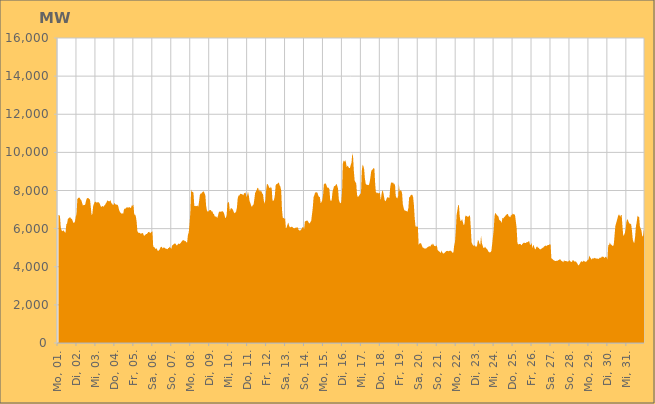
| Category | Series 0 |
|---|---|
|  Mo, 01.  | 6721.456 |
|  Mo, 01.  | 6715.736 |
|  Mo, 01.  | 6638.319 |
|  Mo, 01.  | 6068.683 |
|  Mo, 01.  | 5915.708 |
|  Mo, 01.  | 5864.651 |
|  Mo, 01.  | 5909.291 |
|  Mo, 01.  | 5881.217 |
|  Mo, 01.  | 5816.516 |
|  Mo, 01.  | 5782.45 |
|  Mo, 01.  | 6218.133 |
|  Mo, 01.  | 6266.348 |
|  Mo, 01.  | 6505.071 |
|  Mo, 01.  | 6544.026 |
|  Mo, 01.  | 6581.026 |
|  Mo, 01.  | 6597.355 |
|  Mo, 01.  | 6509.594 |
|  Di, 02.  | 6519.329 |
|  Di, 02.  | 6408.135 |
|  Di, 02.  | 6302.622 |
|  Di, 02.  | 6310.357 |
|  Di, 02.  | 6385.379 |
|  Di, 02.  | 6624.609 |
|  Di, 02.  | 6781.315 |
|  Di, 02.  | 7554.946 |
|  Di, 02.  | 7601.423 |
|  Di, 02.  | 7639.226 |
|  Di, 02.  | 7614.635 |
|  Di, 02.  | 7529.796 |
|  Di, 02.  | 7491.225 |
|  Di, 02.  | 7352.841 |
|  Di, 02.  | 7217.623 |
|  Di, 02.  | 7236.093 |
|  Di, 02.  | 7233.353 |
|  Di, 02.  | 7275.262 |
|  Di, 02.  | 7465.983 |
|  Di, 02.  | 7584.366 |
|  Di, 02.  | 7604.754 |
|  Di, 02.  | 7603.25 |
|  Di, 02.  | 7538.598 |
|  Di, 02.  | 7534.036 |
|  Mi, 03.  | 7130.416 |
|  Mi, 03.  | 6714.614 |
|  Mi, 03.  | 6768.745 |
|  Mi, 03.  | 7181.91 |
|  Mi, 03.  | 7298.979 |
|  Mi, 03.  | 7393.511 |
|  Mi, 03.  | 7416.036 |
|  Mi, 03.  | 7377.556 |
|  Mi, 03.  | 7366.099 |
|  Mi, 03.  | 7392.624 |
|  Mi, 03.  | 7378.483 |
|  Mi, 03.  | 7337.682 |
|  Mi, 03.  | 7235.39 |
|  Mi, 03.  | 7137.836 |
|  Mi, 03.  | 7163.586 |
|  Mi, 03.  | 7190.114 |
|  Mi, 03.  | 7146.197 |
|  Mi, 03.  | 7204.214 |
|  Mi, 03.  | 7240.93 |
|  Mi, 03.  | 7320.254 |
|  Mi, 03.  | 7383.533 |
|  Mi, 03.  | 7482.576 |
|  Mi, 03.  | 7445.427 |
|  Mi, 03.  | 7438.531 |
|  Do, 04.  | 7436.663 |
|  Do, 04.  | 7498.555 |
|  Do, 04.  | 7336.751 |
|  Do, 04.  | 7312.476 |
|  Do, 04.  | 7239.508 |
|  Do, 04.  | 7251.285 |
|  Do, 04.  | 7360.41 |
|  Do, 04.  | 7267.889 |
|  Do, 04.  | 7275.524 |
|  Do, 04.  | 7236.111 |
|  Do, 04.  | 7252.914 |
|  Do, 04.  | 7143.682 |
|  Do, 04.  | 6946.31 |
|  Do, 04.  | 6868.791 |
|  Do, 04.  | 6819.215 |
|  Do, 04.  | 6785.567 |
|  Do, 04.  | 6812.198 |
|  Do, 04.  | 6771.176 |
|  Do, 04.  | 6997.989 |
|  Do, 04.  | 7059.344 |
|  Do, 04.  | 7045.584 |
|  Do, 04.  | 7111.095 |
|  Do, 04.  | 7115.348 |
|  Do, 04.  | 7103.732 |
|  Fr, 05.  | 7108.28 |
|  Fr, 05.  | 7132.108 |
|  Fr, 05.  | 7084.03 |
|  Fr, 05.  | 7105.463 |
|  Fr, 05.  | 7222.852 |
|  Fr, 05.  | 7203.064 |
|  Fr, 05.  | 7254.15 |
|  Fr, 05.  | 6725.617 |
|  Fr, 05.  | 6745.45 |
|  Fr, 05.  | 6648.042 |
|  Fr, 05.  | 6375.856 |
|  Fr, 05.  | 5875.378 |
|  Fr, 05.  | 5783.298 |
|  Fr, 05.  | 5783.094 |
|  Fr, 05.  | 5772.167 |
|  Fr, 05.  | 5736.141 |
|  Fr, 05.  | 5745.019 |
|  Fr, 05.  | 5758.236 |
|  Fr, 05.  | 5774.308 |
|  Fr, 05.  | 5647.593 |
|  Fr, 05.  | 5620.647 |
|  Fr, 05.  | 5676.336 |
|  Fr, 05.  | 5712.087 |
|  Fr, 05.  | 5716.128 |
|  Sa, 06.  | 5775.276 |
|  Sa, 06.  | 5825.116 |
|  Sa, 06.  | 5832.787 |
|  Sa, 06.  | 5756.172 |
|  Sa, 06.  | 5793.87 |
|  Sa, 06.  | 5832.393 |
|  Sa, 06.  | 5850.846 |
|  Sa, 06.  | 5067.276 |
|  Sa, 06.  | 5029.525 |
|  Sa, 06.  | 5004.342 |
|  Sa, 06.  | 4926.366 |
|  Sa, 06.  | 4976.312 |
|  Sa, 06.  | 4908.282 |
|  Sa, 06.  | 4814.158 |
|  Sa, 06.  | 4865.498 |
|  Sa, 06.  | 4897.99 |
|  Sa, 06.  | 4990.333 |
|  Sa, 06.  | 5056.443 |
|  Sa, 06.  | 5031.857 |
|  Sa, 06.  | 4957.888 |
|  Sa, 06.  | 5013.159 |
|  Sa, 06.  | 5006.741 |
|  Sa, 06.  | 4972.732 |
|  Sa, 06.  | 4945.173 |
|  So, 07.  | 4939.781 |
|  So, 07.  | 4916.595 |
|  So, 07.  | 4974.948 |
|  So, 07.  | 4990.603 |
|  So, 07.  | 5051.638 |
|  So, 07.  | 4983.169 |
|  So, 07.  | 4942.388 |
|  So, 07.  | 5121.05 |
|  So, 07.  | 5143.111 |
|  So, 07.  | 5193.209 |
|  So, 07.  | 5217.614 |
|  So, 07.  | 5223.157 |
|  So, 07.  | 5154.078 |
|  So, 07.  | 5108.195 |
|  So, 07.  | 5165.276 |
|  So, 07.  | 5221.986 |
|  So, 07.  | 5184.931 |
|  So, 07.  | 5217.866 |
|  So, 07.  | 5258.265 |
|  So, 07.  | 5320.509 |
|  So, 07.  | 5379.259 |
|  So, 07.  | 5390.22 |
|  So, 07.  | 5393.581 |
|  So, 07.  | 5331.51 |
|  Mo, 08.  | 5359.365 |
|  Mo, 08.  | 5278.197 |
|  Mo, 08.  | 5289.553 |
|  Mo, 08.  | 5680.645 |
|  Mo, 08.  | 5804.764 |
|  Mo, 08.  | 6248.08 |
|  Mo, 08.  | 6830.635 |
|  Mo, 08.  | 8041.491 |
|  Mo, 08.  | 7920.244 |
|  Mo, 08.  | 7933.373 |
|  Mo, 08.  | 7874.865 |
|  Mo, 08.  | 7197.887 |
|  Mo, 08.  | 7177.102 |
|  Mo, 08.  | 7198.18 |
|  Mo, 08.  | 7177.312 |
|  Mo, 08.  | 7215.216 |
|  Mo, 08.  | 7141.744 |
|  Mo, 08.  | 7397.837 |
|  Mo, 08.  | 7758.313 |
|  Mo, 08.  | 7837.203 |
|  Mo, 08.  | 7845.728 |
|  Mo, 08.  | 7897.804 |
|  Mo, 08.  | 7940.201 |
|  Mo, 08.  | 7952.564 |
|  Di, 09.  | 7858.018 |
|  Di, 09.  | 7754.426 |
|  Di, 09.  | 7193.475 |
|  Di, 09.  | 6947.494 |
|  Di, 09.  | 6895.072 |
|  Di, 09.  | 6901.692 |
|  Di, 09.  | 6958.398 |
|  Di, 09.  | 6983.689 |
|  Di, 09.  | 6970.017 |
|  Di, 09.  | 6894.271 |
|  Di, 09.  | 6906.448 |
|  Di, 09.  | 6777.644 |
|  Di, 09.  | 6757.78 |
|  Di, 09.  | 6635.464 |
|  Di, 09.  | 6642.314 |
|  Di, 09.  | 6625.82 |
|  Di, 09.  | 6557.36 |
|  Di, 09.  | 6674.942 |
|  Di, 09.  | 6853.807 |
|  Di, 09.  | 6898.107 |
|  Di, 09.  | 6885.179 |
|  Di, 09.  | 6898.489 |
|  Di, 09.  | 6903.353 |
|  Di, 09.  | 6912.55 |
|  Mi, 10.  | 6862.077 |
|  Mi, 10.  | 6761.93 |
|  Mi, 10.  | 6584.7 |
|  Mi, 10.  | 6555.071 |
|  Mi, 10.  | 6733.081 |
|  Mi, 10.  | 7333.211 |
|  Mi, 10.  | 7408.996 |
|  Mi, 10.  | 7347.348 |
|  Mi, 10.  | 6917.387 |
|  Mi, 10.  | 7051.916 |
|  Mi, 10.  | 7072.702 |
|  Mi, 10.  | 7045.043 |
|  Mi, 10.  | 6978.969 |
|  Mi, 10.  | 6866.307 |
|  Mi, 10.  | 6804.903 |
|  Mi, 10.  | 6840.916 |
|  Mi, 10.  | 6905.355 |
|  Mi, 10.  | 7114.958 |
|  Mi, 10.  | 7599.463 |
|  Mi, 10.  | 7730.814 |
|  Mi, 10.  | 7735.791 |
|  Mi, 10.  | 7820.277 |
|  Mi, 10.  | 7826.333 |
|  Mi, 10.  | 7809.527 |
|  Do, 11.  | 7795.543 |
|  Do, 11.  | 7740.663 |
|  Do, 11.  | 7854.767 |
|  Do, 11.  | 7867.227 |
|  Do, 11.  | 7894.281 |
|  Do, 11.  | 7648.779 |
|  Do, 11.  | 7750.031 |
|  Do, 11.  | 7932.14 |
|  Do, 11.  | 7743.987 |
|  Do, 11.  | 7442.99 |
|  Do, 11.  | 7343.377 |
|  Do, 11.  | 7200.999 |
|  Do, 11.  | 7143.057 |
|  Do, 11.  | 7229.793 |
|  Do, 11.  | 7257.247 |
|  Do, 11.  | 7525.848 |
|  Do, 11.  | 7862.592 |
|  Do, 11.  | 7953.227 |
|  Do, 11.  | 8030.865 |
|  Do, 11.  | 8143.53 |
|  Do, 11.  | 8121.3 |
|  Do, 11.  | 7938.516 |
|  Do, 11.  | 8051.859 |
|  Do, 11.  | 7949.93 |
|  Fr, 12.  | 7964.933 |
|  Fr, 12.  | 7841.296 |
|  Fr, 12.  | 7812.144 |
|  Fr, 12.  | 7481.194 |
|  Fr, 12.  | 7309.15 |
|  Fr, 12.  | 7519.342 |
|  Fr, 12.  | 8017.354 |
|  Fr, 12.  | 8347.528 |
|  Fr, 12.  | 8328.092 |
|  Fr, 12.  | 8245.396 |
|  Fr, 12.  | 8141.733 |
|  Fr, 12.  | 8123.745 |
|  Fr, 12.  | 8196.113 |
|  Fr, 12.  | 8089.146 |
|  Fr, 12.  | 7480.466 |
|  Fr, 12.  | 7450.539 |
|  Fr, 12.  | 7521.743 |
|  Fr, 12.  | 7754.802 |
|  Fr, 12.  | 8266.786 |
|  Fr, 12.  | 8338.787 |
|  Fr, 12.  | 8345.228 |
|  Fr, 12.  | 8388.291 |
|  Fr, 12.  | 8421.917 |
|  Fr, 12.  | 8280.269 |
|  Sa, 13.  | 8202.482 |
|  Sa, 13.  | 8008.893 |
|  Sa, 13.  | 7014.946 |
|  Sa, 13.  | 6575.561 |
|  Sa, 13.  | 6559.7 |
|  Sa, 13.  | 6511.083 |
|  Sa, 13.  | 6529.54 |
|  Sa, 13.  | 6006.638 |
|  Sa, 13.  | 6085.171 |
|  Sa, 13.  | 6215.821 |
|  Sa, 13.  | 6324.248 |
|  Sa, 13.  | 6151.244 |
|  Sa, 13.  | 6075.658 |
|  Sa, 13.  | 6072.147 |
|  Sa, 13.  | 6104.142 |
|  Sa, 13.  | 6096.276 |
|  Sa, 13.  | 6043.823 |
|  Sa, 13.  | 6023.769 |
|  Sa, 13.  | 6014.304 |
|  Sa, 13.  | 6046.117 |
|  Sa, 13.  | 6065.092 |
|  Sa, 13.  | 6041.964 |
|  Sa, 13.  | 6080.157 |
|  Sa, 13.  | 5936.382 |
|  So, 14.  | 5898.133 |
|  So, 14.  | 5894.451 |
|  So, 14.  | 5948.317 |
|  So, 14.  | 5989.702 |
|  So, 14.  | 6077.339 |
|  So, 14.  | 6087.218 |
|  So, 14.  | 5969.672 |
|  So, 14.  | 6362.774 |
|  So, 14.  | 6397.374 |
|  So, 14.  | 6411.55 |
|  So, 14.  | 6429.896 |
|  So, 14.  | 6375.685 |
|  So, 14.  | 6294.601 |
|  So, 14.  | 6273.437 |
|  So, 14.  | 6343.967 |
|  So, 14.  | 6410.555 |
|  So, 14.  | 6750.263 |
|  So, 14.  | 7096.198 |
|  So, 14.  | 7654.69 |
|  So, 14.  | 7762.322 |
|  So, 14.  | 7900.379 |
|  So, 14.  | 7888.329 |
|  So, 14.  | 7913.45 |
|  So, 14.  | 7873.949 |
|  Mo, 15.  | 7723.65 |
|  Mo, 15.  | 7667.873 |
|  Mo, 15.  | 7651.117 |
|  Mo, 15.  | 7327.941 |
|  Mo, 15.  | 7394.902 |
|  Mo, 15.  | 7493.562 |
|  Mo, 15.  | 7764.823 |
|  Mo, 15.  | 8307.061 |
|  Mo, 15.  | 8363.596 |
|  Mo, 15.  | 8378.509 |
|  Mo, 15.  | 8320.499 |
|  Mo, 15.  | 8188.994 |
|  Mo, 15.  | 8136.348 |
|  Mo, 15.  | 8145.628 |
|  Mo, 15.  | 8073.029 |
|  Mo, 15.  | 7534.898 |
|  Mo, 15.  | 7431.974 |
|  Mo, 15.  | 7523.615 |
|  Mo, 15.  | 7939.672 |
|  Mo, 15.  | 8087.875 |
|  Mo, 15.  | 8236.691 |
|  Mo, 15.  | 8218.636 |
|  Mo, 15.  | 8296.164 |
|  Mo, 15.  | 8348.463 |
|  Di, 16.  | 8244.564 |
|  Di, 16.  | 8087.211 |
|  Di, 16.  | 7530.38 |
|  Di, 16.  | 7384.465 |
|  Di, 16.  | 7326.262 |
|  Di, 16.  | 7385.847 |
|  Di, 16.  | 7897.539 |
|  Di, 16.  | 9401.103 |
|  Di, 16.  | 9576.302 |
|  Di, 16.  | 9512.207 |
|  Di, 16.  | 9596.837 |
|  Di, 16.  | 9460.57 |
|  Di, 16.  | 9226.088 |
|  Di, 16.  | 9305.356 |
|  Di, 16.  | 9244.717 |
|  Di, 16.  | 9174.074 |
|  Di, 16.  | 9180.14 |
|  Di, 16.  | 9347.63 |
|  Di, 16.  | 9452.273 |
|  Di, 16.  | 9960.64 |
|  Di, 16.  | 9761.621 |
|  Di, 16.  | 9013.397 |
|  Di, 16.  | 8513.674 |
|  Di, 16.  | 8437.82 |
|  Mi, 17.  | 8372.816 |
|  Mi, 17.  | 7786.222 |
|  Mi, 17.  | 7654.974 |
|  Mi, 17.  | 7699.155 |
|  Mi, 17.  | 7751.344 |
|  Mi, 17.  | 7825.64 |
|  Mi, 17.  | 7849.899 |
|  Mi, 17.  | 9020.704 |
|  Mi, 17.  | 9350.178 |
|  Mi, 17.  | 9288.447 |
|  Mi, 17.  | 9116.475 |
|  Mi, 17.  | 8611.584 |
|  Mi, 17.  | 8354.896 |
|  Mi, 17.  | 8305.793 |
|  Mi, 17.  | 8290.233 |
|  Mi, 17.  | 8302.316 |
|  Mi, 17.  | 8281.038 |
|  Mi, 17.  | 8438.337 |
|  Mi, 17.  | 8707.511 |
|  Mi, 17.  | 9022.035 |
|  Mi, 17.  | 9087.262 |
|  Mi, 17.  | 9106.556 |
|  Mi, 17.  | 9185.624 |
|  Mi, 17.  | 9137.37 |
|  Do, 18.  | 8327.207 |
|  Do, 18.  | 7849.118 |
|  Do, 18.  | 7912.117 |
|  Do, 18.  | 7867.141 |
|  Do, 18.  | 7851.351 |
|  Do, 18.  | 7861.15 |
|  Do, 18.  | 7889.222 |
|  Do, 18.  | 7481.208 |
|  Do, 18.  | 7795.403 |
|  Do, 18.  | 8016.617 |
|  Do, 18.  | 7946.487 |
|  Do, 18.  | 7723.795 |
|  Do, 18.  | 7483.348 |
|  Do, 18.  | 7426.965 |
|  Do, 18.  | 7519.413 |
|  Do, 18.  | 7627.833 |
|  Do, 18.  | 7652.044 |
|  Do, 18.  | 7622.024 |
|  Do, 18.  | 7618.944 |
|  Do, 18.  | 8173.034 |
|  Do, 18.  | 8406.003 |
|  Do, 18.  | 8423.146 |
|  Do, 18.  | 8406.437 |
|  Do, 18.  | 8404.281 |
|  Fr, 19.  | 8292.683 |
|  Fr, 19.  | 8371.148 |
|  Fr, 19.  | 7714.492 |
|  Fr, 19.  | 7617.664 |
|  Fr, 19.  | 7583.349 |
|  Fr, 19.  | 7702.628 |
|  Fr, 19.  | 8317.229 |
|  Fr, 19.  | 7942.751 |
|  Fr, 19.  | 8017.366 |
|  Fr, 19.  | 7994.087 |
|  Fr, 19.  | 7861.157 |
|  Fr, 19.  | 7274.293 |
|  Fr, 19.  | 7085.999 |
|  Fr, 19.  | 6961.503 |
|  Fr, 19.  | 6945.798 |
|  Fr, 19.  | 6928.106 |
|  Fr, 19.  | 6908.253 |
|  Fr, 19.  | 6891.99 |
|  Fr, 19.  | 7088.458 |
|  Fr, 19.  | 7652.635 |
|  Fr, 19.  | 7667.061 |
|  Fr, 19.  | 7759.166 |
|  Fr, 19.  | 7775.603 |
|  Fr, 19.  | 7777.44 |
|  Sa, 20.  | 7642.318 |
|  Sa, 20.  | 7232.579 |
|  Sa, 20.  | 6549.486 |
|  Sa, 20.  | 6114.486 |
|  Sa, 20.  | 6110.764 |
|  Sa, 20.  | 6097.407 |
|  Sa, 20.  | 6114.271 |
|  Sa, 20.  | 5138.184 |
|  Sa, 20.  | 5222.61 |
|  Sa, 20.  | 5232.545 |
|  Sa, 20.  | 5238.113 |
|  Sa, 20.  | 5119.99 |
|  Sa, 20.  | 5015.189 |
|  Sa, 20.  | 4999.12 |
|  Sa, 20.  | 4961.209 |
|  Sa, 20.  | 4953.987 |
|  Sa, 20.  | 4952.263 |
|  Sa, 20.  | 4972.683 |
|  Sa, 20.  | 5022.562 |
|  Sa, 20.  | 5036.859 |
|  Sa, 20.  | 5080.137 |
|  Sa, 20.  | 5070.184 |
|  Sa, 20.  | 5065.613 |
|  Sa, 20.  | 5186.334 |
|  So, 21.  | 5124.866 |
|  So, 21.  | 5223.164 |
|  So, 21.  | 5152.454 |
|  So, 21.  | 5083.678 |
|  So, 21.  | 5092.513 |
|  So, 21.  | 5068.547 |
|  So, 21.  | 5131.725 |
|  So, 21.  | 4877.981 |
|  So, 21.  | 4843.34 |
|  So, 21.  | 4801.249 |
|  So, 21.  | 4772.555 |
|  So, 21.  | 4711.332 |
|  So, 21.  | 4855.946 |
|  So, 21.  | 4744.245 |
|  So, 21.  | 4694.453 |
|  So, 21.  | 4702.964 |
|  So, 21.  | 4736.38 |
|  So, 21.  | 4786.584 |
|  So, 21.  | 4823.654 |
|  So, 21.  | 4835.022 |
|  So, 21.  | 4824.706 |
|  So, 21.  | 4814.956 |
|  So, 21.  | 4832.99 |
|  So, 21.  | 4843.316 |
|  Mo, 22.  | 4833.335 |
|  Mo, 22.  | 4781.119 |
|  Mo, 22.  | 4730.177 |
|  Mo, 22.  | 4760.375 |
|  Mo, 22.  | 5119.334 |
|  Mo, 22.  | 5304.418 |
|  Mo, 22.  | 5846.487 |
|  Mo, 22.  | 6707.004 |
|  Mo, 22.  | 6958.515 |
|  Mo, 22.  | 7223.199 |
|  Mo, 22.  | 7237.401 |
|  Mo, 22.  | 6642.498 |
|  Mo, 22.  | 6397.471 |
|  Mo, 22.  | 6416.333 |
|  Mo, 22.  | 6494.513 |
|  Mo, 22.  | 6337.544 |
|  Mo, 22.  | 6185.114 |
|  Mo, 22.  | 6230.897 |
|  Mo, 22.  | 6695.127 |
|  Mo, 22.  | 6641.387 |
|  Mo, 22.  | 6678.925 |
|  Mo, 22.  | 6613.475 |
|  Mo, 22.  | 6634.433 |
|  Mo, 22.  | 6661.149 |
|  Di, 23.  | 6702.472 |
|  Di, 23.  | 6036.59 |
|  Di, 23.  | 5289.653 |
|  Di, 23.  | 5180.751 |
|  Di, 23.  | 5124.7 |
|  Di, 23.  | 5089.356 |
|  Di, 23.  | 5136.853 |
|  Di, 23.  | 5063.905 |
|  Di, 23.  | 5043.774 |
|  Di, 23.  | 5122.713 |
|  Di, 23.  | 5402.251 |
|  Di, 23.  | 5360.449 |
|  Di, 23.  | 5209.574 |
|  Di, 23.  | 5147.759 |
|  Di, 23.  | 5633.78 |
|  Di, 23.  | 5244.806 |
|  Di, 23.  | 5112.452 |
|  Di, 23.  | 4987.488 |
|  Di, 23.  | 4975.688 |
|  Di, 23.  | 5057.682 |
|  Di, 23.  | 4993.95 |
|  Di, 23.  | 4945.917 |
|  Di, 23.  | 4902.942 |
|  Di, 23.  | 4817.31 |
|  Mi, 24.  | 4773.174 |
|  Mi, 24.  | 4749.285 |
|  Mi, 24.  | 4767.257 |
|  Mi, 24.  | 4822.149 |
|  Mi, 24.  | 5168.958 |
|  Mi, 24.  | 5550.619 |
|  Mi, 24.  | 5927.984 |
|  Mi, 24.  | 6643.883 |
|  Mi, 24.  | 6832.21 |
|  Mi, 24.  | 6777.863 |
|  Mi, 24.  | 6708.671 |
|  Mi, 24.  | 6674.184 |
|  Mi, 24.  | 6636.693 |
|  Mi, 24.  | 6454.466 |
|  Mi, 24.  | 6434.444 |
|  Mi, 24.  | 6391.38 |
|  Mi, 24.  | 6295.798 |
|  Mi, 24.  | 6562.527 |
|  Mi, 24.  | 6527.915 |
|  Mi, 24.  | 6588.853 |
|  Mi, 24.  | 6624.447 |
|  Mi, 24.  | 6689.565 |
|  Mi, 24.  | 6731.035 |
|  Mi, 24.  | 6768.137 |
|  Do, 25.  | 6756.879 |
|  Do, 25.  | 6644.042 |
|  Do, 25.  | 6626.932 |
|  Do, 25.  | 6594.44 |
|  Do, 25.  | 6732.833 |
|  Do, 25.  | 6692.771 |
|  Do, 25.  | 6794.079 |
|  Do, 25.  | 6745.966 |
|  Do, 25.  | 6756.391 |
|  Do, 25.  | 6702.238 |
|  Do, 25.  | 6387.722 |
|  Do, 25.  | 6045.515 |
|  Do, 25.  | 5265.53 |
|  Do, 25.  | 5153.469 |
|  Do, 25.  | 5195.692 |
|  Do, 25.  | 5191.952 |
|  Do, 25.  | 5187.176 |
|  Do, 25.  | 5123.915 |
|  Do, 25.  | 5178.698 |
|  Do, 25.  | 5227.622 |
|  Do, 25.  | 5267.071 |
|  Do, 25.  | 5257.049 |
|  Do, 25.  | 5244.128 |
|  Do, 25.  | 5253.325 |
|  Fr, 26.  | 5305.192 |
|  Fr, 26.  | 5277.245 |
|  Fr, 26.  | 5334.835 |
|  Fr, 26.  | 5335.509 |
|  Fr, 26.  | 5139.748 |
|  Fr, 26.  | 5162.289 |
|  Fr, 26.  | 5244.586 |
|  Fr, 26.  | 4963.618 |
|  Fr, 26.  | 5166.143 |
|  Fr, 26.  | 5069.221 |
|  Fr, 26.  | 4952.358 |
|  Fr, 26.  | 4911.792 |
|  Fr, 26.  | 5031.387 |
|  Fr, 26.  | 5065.517 |
|  Fr, 26.  | 5000.465 |
|  Fr, 26.  | 4989.705 |
|  Fr, 26.  | 4932.524 |
|  Fr, 26.  | 4908.773 |
|  Fr, 26.  | 4940.011 |
|  Fr, 26.  | 4959.218 |
|  Fr, 26.  | 5000.71 |
|  Fr, 26.  | 5010.847 |
|  Fr, 26.  | 5075.046 |
|  Fr, 26.  | 5089.029 |
|  Sa, 27.  | 5118.112 |
|  Sa, 27.  | 5079.412 |
|  Sa, 27.  | 5131.281 |
|  Sa, 27.  | 5140.07 |
|  Sa, 27.  | 5140.934 |
|  Sa, 27.  | 5188.219 |
|  Sa, 27.  | 5167.42 |
|  Sa, 27.  | 4441.998 |
|  Sa, 27.  | 4422.262 |
|  Sa, 27.  | 4368.454 |
|  Sa, 27.  | 4338.753 |
|  Sa, 27.  | 4322.59 |
|  Sa, 27.  | 4294.585 |
|  Sa, 27.  | 4307.729 |
|  Sa, 27.  | 4317.587 |
|  Sa, 27.  | 4319.008 |
|  Sa, 27.  | 4350.441 |
|  Sa, 27.  | 4370.189 |
|  Sa, 27.  | 4404.801 |
|  Sa, 27.  | 4339.759 |
|  Sa, 27.  | 4303.702 |
|  Sa, 27.  | 4284.274 |
|  Sa, 27.  | 4232.473 |
|  Sa, 27.  | 4351.256 |
|  So, 28.  | 4292.667 |
|  So, 28.  | 4305.731 |
|  So, 28.  | 4294.367 |
|  So, 28.  | 4277.655 |
|  So, 28.  | 4271.077 |
|  So, 28.  | 4297.187 |
|  So, 28.  | 4347.167 |
|  So, 28.  | 4279.978 |
|  So, 28.  | 4259.458 |
|  So, 28.  | 4247.526 |
|  So, 28.  | 4351.527 |
|  So, 28.  | 4341.244 |
|  So, 28.  | 4268.342 |
|  So, 28.  | 4275.85 |
|  So, 28.  | 4273.111 |
|  So, 28.  | 4222.176 |
|  So, 28.  | 4160.04 |
|  So, 28.  | 4067.191 |
|  So, 28.  | 4102.522 |
|  So, 28.  | 4161.738 |
|  So, 28.  | 4251.054 |
|  So, 28.  | 4288.402 |
|  So, 28.  | 4265.637 |
|  So, 28.  | 4267.823 |
|  Mo, 29.  | 4324.08 |
|  Mo, 29.  | 4272.646 |
|  Mo, 29.  | 4267.05 |
|  Mo, 29.  | 4255.581 |
|  Mo, 29.  | 4303.422 |
|  Mo, 29.  | 4366.016 |
|  Mo, 29.  | 4370.888 |
|  Mo, 29.  | 4588.541 |
|  Mo, 29.  | 4501.767 |
|  Mo, 29.  | 4433.885 |
|  Mo, 29.  | 4379.034 |
|  Mo, 29.  | 4446.228 |
|  Mo, 29.  | 4432.239 |
|  Mo, 29.  | 4441.708 |
|  Mo, 29.  | 4468.925 |
|  Mo, 29.  | 4433.625 |
|  Mo, 29.  | 4436.502 |
|  Mo, 29.  | 4415.748 |
|  Mo, 29.  | 4442.411 |
|  Mo, 29.  | 4400.59 |
|  Mo, 29.  | 4471.982 |
|  Mo, 29.  | 4467.958 |
|  Mo, 29.  | 4476.035 |
|  Mo, 29.  | 4544.275 |
|  Di, 30.  | 4517.816 |
|  Di, 30.  | 4524.583 |
|  Di, 30.  | 4461.587 |
|  Di, 30.  | 4497.751 |
|  Di, 30.  | 4530.71 |
|  Di, 30.  | 4485.81 |
|  Di, 30.  | 4382.49 |
|  Di, 30.  | 5147.691 |
|  Di, 30.  | 5128.965 |
|  Di, 30.  | 5271.269 |
|  Di, 30.  | 5176.736 |
|  Di, 30.  | 5153.476 |
|  Di, 30.  | 5115.264 |
|  Di, 30.  | 5077.673 |
|  Di, 30.  | 5176.632 |
|  Di, 30.  | 5659.869 |
|  Di, 30.  | 6140.079 |
|  Di, 30.  | 6293.979 |
|  Di, 30.  | 6436.589 |
|  Di, 30.  | 6596.462 |
|  Di, 30.  | 6720.319 |
|  Di, 30.  | 6737.561 |
|  Di, 30.  | 6624.56 |
|  Di, 30.  | 6709.589 |
|  Mi, 31.  | 6711.274 |
|  Mi, 31.  | 6107.422 |
|  Mi, 31.  | 5620.394 |
|  Mi, 31.  | 5668.991 |
|  Mi, 31.  | 5769.334 |
|  Mi, 31.  | 5988.401 |
|  Mi, 31.  | 6356.958 |
|  Mi, 31.  | 6496.335 |
|  Mi, 31.  | 6449.086 |
|  Mi, 31.  | 6321.609 |
|  Mi, 31.  | 6259.444 |
|  Mi, 31.  | 6257.197 |
|  Mi, 31.  | 6219.636 |
|  Mi, 31.  | 5894.318 |
|  Mi, 31.  | 5433.066 |
|  Mi, 31.  | 5294.605 |
|  Mi, 31.  | 5251.711 |
|  Mi, 31.  | 5579.591 |
|  Mi, 31.  | 6107.97 |
|  Mi, 31.  | 6344.838 |
|  Mi, 31.  | 6677.461 |
|  Mi, 31.  | 6629.18 |
|  Mi, 31.  | 6623.648 |
|  Mi, 31.  | 6128.231 |
|  Do, 01.  | 6006.715 |
|  Do, 01.  | 5907.149 |
|  Do, 01.  | 5616.284 |
|  Do, 01.  | 5587.882 |
|  Do, 01.  | 5939.176 |
|  Do, 01.  | 5894.94 |